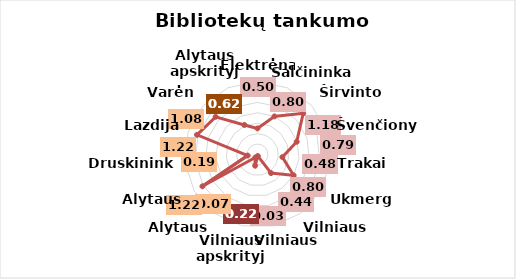
| Category | Series 0 |
|---|---|
| Elektrėnai | 0.5 |
| Šalčininkai | 0.8 |
| Širvintos | 1.18 |
| Švenčionys | 0.79 |
| Trakai | 0.48 |
| Ukmergė | 0.8 |
| Vilniaus r. | 0.44 |
| Vilniaus m. | 0.03 |
| Vilniaus apskrityje | 0.22 |
| Alytaus m. | 0.07 |
| Alytaus r. | 1.22 |
| Druskininkai | 0.19 |
| Lazdijai | 1.22 |
| Varėna | 1.08 |
| Alytaus apskrityje | 0.62 |